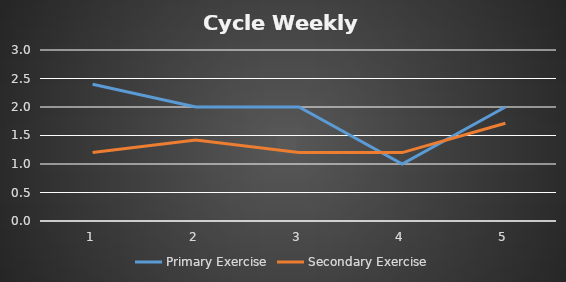
| Category | Primary Exercise | Secondary Exercise |
|---|---|---|
| 0 | 2.4 | 1.2 |
| 1 | 2 | 1.422 |
| 2 | 2 | 1.2 |
| 3 | 1 | 1.2 |
| 4 | 2 | 1.714 |